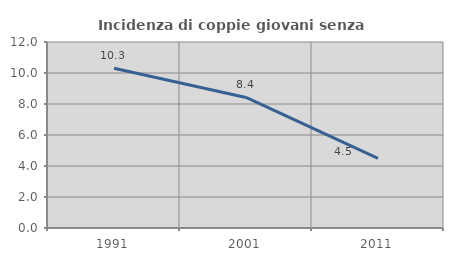
| Category | Incidenza di coppie giovani senza figli |
|---|---|
| 1991.0 | 10.309 |
| 2001.0 | 8.421 |
| 2011.0 | 4.494 |